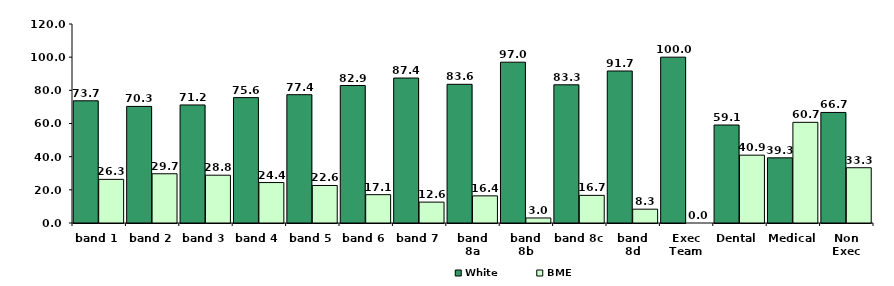
| Category | White | BME |
|---|---|---|
| band 1 | 73.684 | 26.316 |
| band 2 | 70.307 | 29.693 |
| band 3 | 71.176 | 28.824 |
| band 4 | 75.61 | 24.39 |
| band 5 | 77.376 | 22.624 |
| band 6 | 82.911 | 17.089 |
| band 7 | 87.41 | 12.59 |
| band 8a | 83.636 | 16.364 |
| band 8b | 96.97 | 3.03 |
| band 8c | 83.333 | 16.667 |
| band 8d | 91.667 | 8.333 |
| Exec Team | 100 | 0 |
| Dental | 59.091 | 40.909 |
| Medical | 39.286 | 60.714 |
| Non Exec | 66.667 | 33.333 |